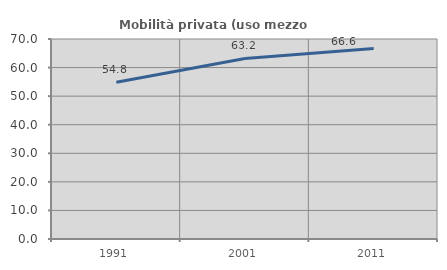
| Category | Mobilità privata (uso mezzo privato) |
|---|---|
| 1991.0 | 54.833 |
| 2001.0 | 63.201 |
| 2011.0 | 66.648 |